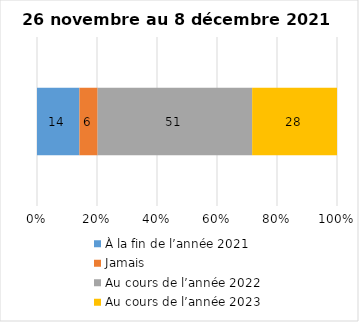
| Category | À la fin de l’année 2021 | Jamais | Au cours de l’année 2022 | Au cours de l’année 2023 |
|---|---|---|---|---|
| 0 | 14 | 6 | 51 | 28 |